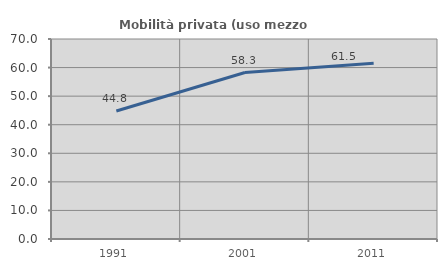
| Category | Mobilità privata (uso mezzo privato) |
|---|---|
| 1991.0 | 44.806 |
| 2001.0 | 58.27 |
| 2011.0 | 61.502 |